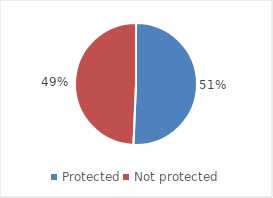
| Category | Series 0 |
|---|---|
| Protected | 1308543.25 |
| Not protected | 1274141.75 |